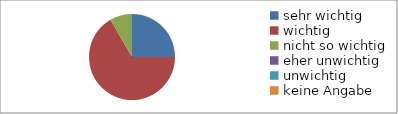
| Category | Series 0 |
|---|---|
| sehr wichtig | 6 |
| wichtig | 16 |
| nicht so wichtig | 2 |
| eher unwichtig | 0 |
| unwichtig | 0 |
| keine Angabe | 0 |